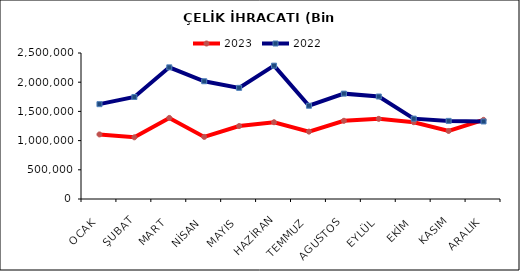
| Category | 2023 | 2022 |
|---|---|---|
| OCAK | 1105699.594 | 1623907.894 |
| ŞUBAT | 1056070.546 | 1746698.62 |
| MART | 1388525.642 | 2254350.394 |
| NİSAN | 1063458.912 | 2016288.071 |
| MAYIS | 1249314.543 | 1903111.087 |
| HAZİRAN | 1314445.236 | 2283458.267 |
| TEMMUZ | 1153712.711 | 1596973.667 |
| AGUSTOS | 1338987.666 | 1804223.834 |
| EYLÜL | 1372340.364 | 1754835.05 |
| EKİM | 1315166.548 | 1376189.624 |
| KASIM | 1164884.423 | 1337667.346 |
| ARALIK | 1355230.045 | 1327665.918 |